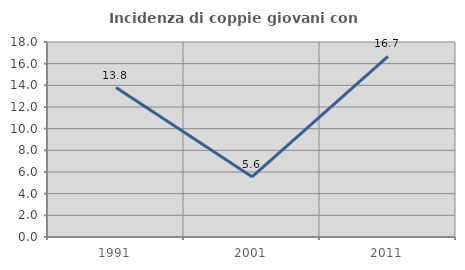
| Category | Incidenza di coppie giovani con figli |
|---|---|
| 1991.0 | 13.793 |
| 2001.0 | 5.556 |
| 2011.0 | 16.667 |